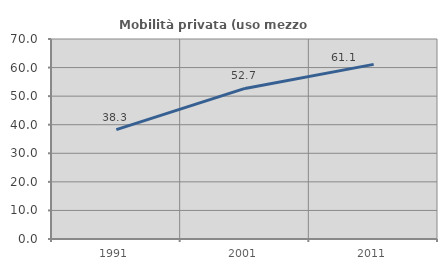
| Category | Mobilità privata (uso mezzo privato) |
|---|---|
| 1991.0 | 38.267 |
| 2001.0 | 52.698 |
| 2011.0 | 61.111 |